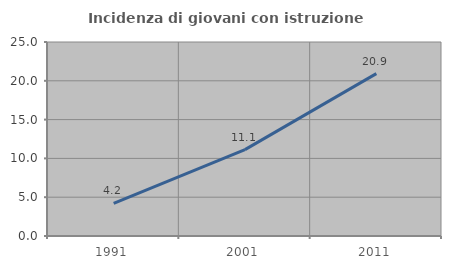
| Category | Incidenza di giovani con istruzione universitaria |
|---|---|
| 1991.0 | 4.19 |
| 2001.0 | 11.136 |
| 2011.0 | 20.93 |